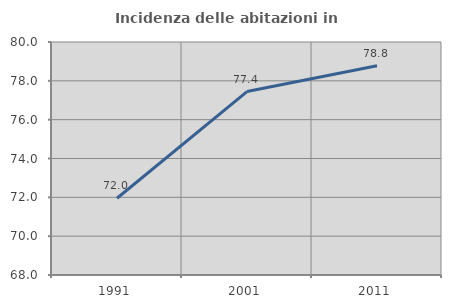
| Category | Incidenza delle abitazioni in proprietà  |
|---|---|
| 1991.0 | 71.951 |
| 2001.0 | 77.448 |
| 2011.0 | 78.778 |